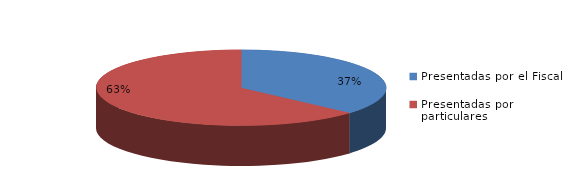
| Category | Series 0 |
|---|---|
| Presentadas por el Fiscal | 75 |
| Presentadas por particulares | 130 |